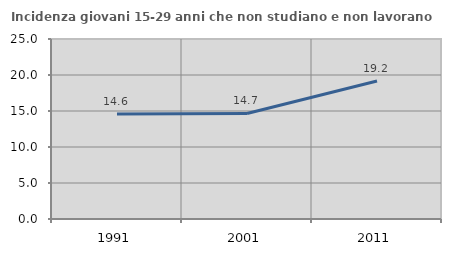
| Category | Incidenza giovani 15-29 anni che non studiano e non lavorano  |
|---|---|
| 1991.0 | 14.588 |
| 2001.0 | 14.658 |
| 2011.0 | 19.168 |